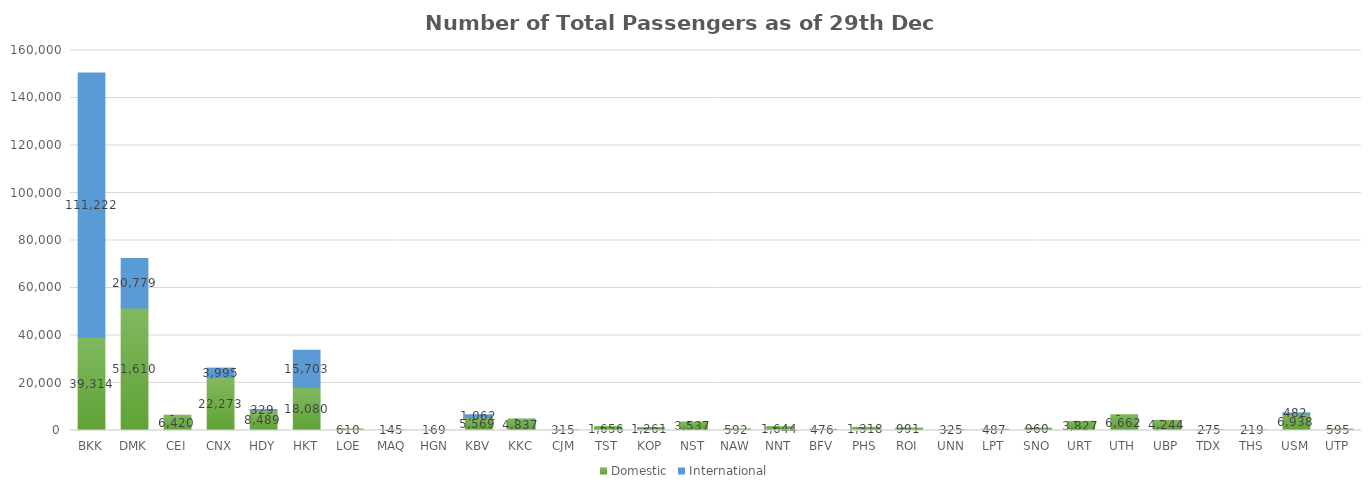
| Category | Domestic | International |
|---|---|---|
| BKK | 39314 | 111222 |
| DMK | 51610 | 20779 |
| CEI | 6420 | 0 |
| CNX | 22273 | 3995 |
| HDY | 8489 | 329 |
| HKT | 18080 | 15703 |
| LOE | 610 | 0 |
| MAQ | 145 | 0 |
| HGN | 169 | 0 |
| KBV | 5569 | 1062 |
| KKC | 4837 | 0 |
| CJM | 315 | 0 |
| TST | 1656 | 0 |
| KOP | 1261 | 0 |
| NST | 3537 | 0 |
| NAW | 592 | 0 |
| NNT | 1644 | 0 |
| BFV | 476 | 0 |
| PHS | 1318 | 0 |
| ROI | 991 | 0 |
| UNN | 325 | 0 |
| LPT | 487 | 0 |
| SNO | 960 | 0 |
| URT | 3827 | 0 |
| UTH | 6662 | 0 |
| UBP | 4244 | 0 |
| TDX | 275 | 0 |
| THS | 219 | 0 |
| USM | 6938 | 482 |
| UTP | 595 | 0 |